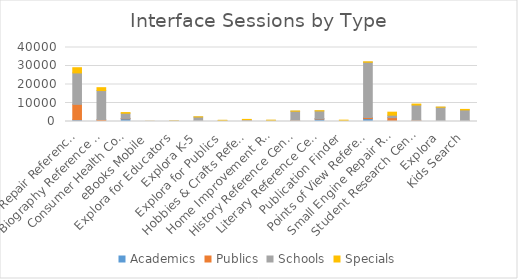
| Category | Academics | Publics | Schools | Specials |
|---|---|---|---|---|
| Auto Repair Reference Center | 937 | 8331 | 16996 | 2803 |
| Biography Reference Center | 530 | 559 | 15635 | 1561 |
| Consumer Health Complete | 1475 | 211 | 2793 | 341 |
| eBooks Mobile | 15 | 21 | 7 | 27 |
| Explora for Educators | 15 | 19 | 215 | 3 |
| Explora K-5 | 34 | 107 | 2315 | 45 |
| Explora for Publics | 0 | 128 | 444 | 72 |
| Hobbies & Crafts Reference Center | 172 | 467 | 367 | 128 |
| Home Improvement Reference Center | 87 | 256 | 249 | 118 |
| History Reference Center | 512 | 135 | 4933 | 67 |
| Literary Reference Center / LRC Plus | 1335 | 225 | 4156 | 90 |
| Publication Finder | 33 | 29 | 62 | 605 |
| Points of View Reference Center | 1552 | 594 | 29893 | 213 |
| Small Engine Repair Reference Center | 571 | 1523 | 1313 | 1637 |
| Student Research Center | 269 | 417 | 8227 | 499 |
| Explora | 28 | 110 | 7576 | 56 |
| Kids Search | 142 | 283 | 5833 | 277 |